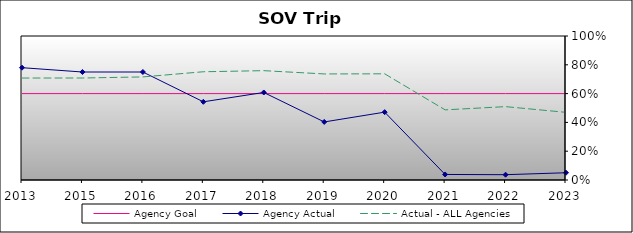
| Category | Agency Goal | Agency Actual | Actual - ALL Agencies |
|---|---|---|---|
| 2013.0 | 0.6 | 0.78 | 0.708 |
| 2015.0 | 0.6 | 0.75 | 0.708 |
| 2016.0 | 0.6 | 0.75 | 0.716 |
| 2017.0 | 0.6 | 0.543 | 0.752 |
| 2018.0 | 0.6 | 0.608 | 0.759 |
| 2019.0 | 0.6 | 0.403 | 0.736 |
| 2020.0 | 0.6 | 0.471 | 0.737 |
| 2021.0 | 0.6 | 0.038 | 0.487 |
| 2022.0 | 0.6 | 0.037 | 0.509 |
| 2023.0 | 0.6 | 0.05 | 0.47 |